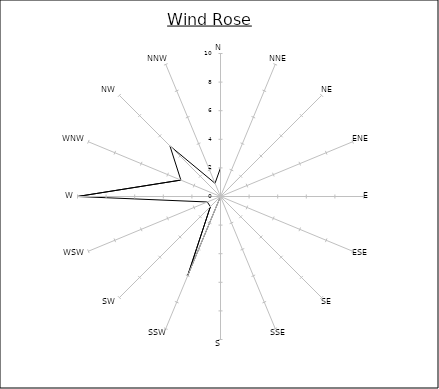
| Category | Series 0 |
|---|---|
| N | 2 |
| NNE | 0 |
| NE | 2 |
| ENE | 0 |
| E | 0 |
| ESE | 0 |
| SE | 0 |
| SSE | 0 |
| S | 0 |
| SSW | 6 |
| SW | 1 |
| WSW | 1 |
| W | 10 |
| WNW | 3 |
| NW | 5 |
| NNW | 1 |